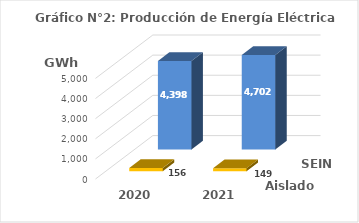
| Category | Aislados | SEIN |
|---|---|---|
| 2020.0 | 155.873 | 4397.75 |
| 2021.0 | 148.934 | 4701.757 |